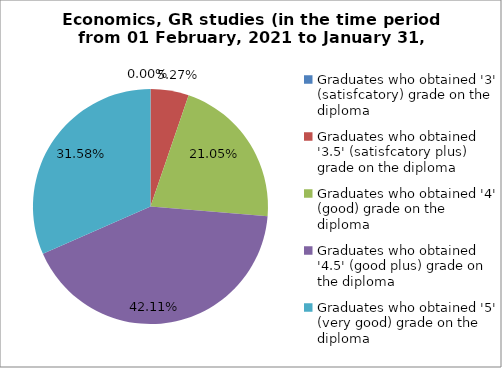
| Category | Series 0 |
|---|---|
| Graduates who obtained '3' (satisfcatory) grade on the diploma  | 0 |
| Graduates who obtained '3.5' (satisfcatory plus) grade on the diploma  | 5.263 |
| Graduates who obtained '4' (good) grade on the diploma  | 21.053 |
| Graduates who obtained '4.5' (good plus) grade on the diploma  | 42.105 |
| Graduates who obtained '5' (very good) grade on the diploma  | 31.579 |